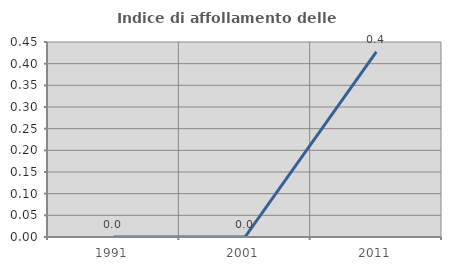
| Category | Indice di affollamento delle abitazioni  |
|---|---|
| 1991.0 | 0 |
| 2001.0 | 0 |
| 2011.0 | 0.427 |